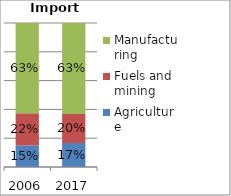
| Category | Agriculture | Fuels and mining | Manufacturing |
|---|---|---|---|
| 2006.0 | 0.15 | 0.223 | 0.627 |
| 2017.0 | 0.167 | 0.202 | 0.632 |